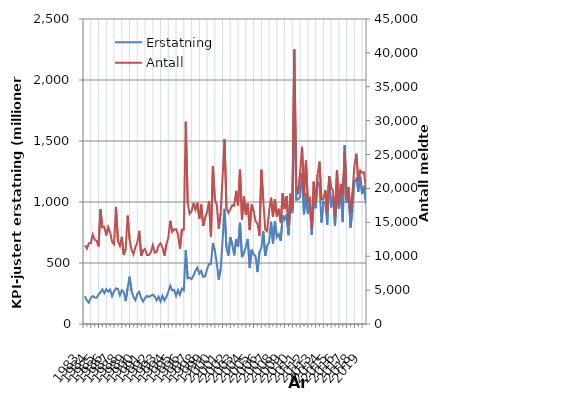
| Category | Erstatning |
|---|---|
| 1983.0 | 227.996 |
| nan | 190.982 |
| nan | 174.653 |
| nan | 213.943 |
| 1984.0 | 229.417 |
| nan | 217.012 |
| nan | 215.163 |
| nan | 240.661 |
| 1985.0 | 260.066 |
| nan | 284.26 |
| nan | 251.888 |
| nan | 285.674 |
| 1986.0 | 264.864 |
| nan | 283.416 |
| nan | 228.111 |
| nan | 266.943 |
| 1987.0 | 291.63 |
| nan | 287.785 |
| nan | 235.506 |
| nan | 277.08 |
| 1988.0 | 263.725 |
| nan | 187.995 |
| nan | 292.807 |
| nan | 387.887 |
| 1989.0 | 274.034 |
| nan | 221.485 |
| nan | 194.888 |
| nan | 245.873 |
| 1990.0 | 263.265 |
| nan | 211.798 |
| nan | 183.685 |
| nan | 213.803 |
| 1991.0 | 230.713 |
| nan | 221.83 |
| nan | 232.16 |
| nan | 240.024 |
| 1992.0 | 224.227 |
| nan | 193.206 |
| nan | 223.245 |
| nan | 184.221 |
| 1993.0 | 231.147 |
| nan | 192.366 |
| nan | 222.245 |
| nan | 262.922 |
| 1994.0 | 314.907 |
| nan | 275.3 |
| nan | 279.702 |
| nan | 230.544 |
| 1995.0 | 277.757 |
| nan | 238.953 |
| nan | 290.353 |
| nan | 275.676 |
| 1996.0 | 604.555 |
| nan | 374.351 |
| nan | 381.039 |
| nan | 367.482 |
| 1997.0 | 397.832 |
| nan | 436.552 |
| nan | 462.314 |
| nan | 412.491 |
| 1998.0 | 435.168 |
| nan | 385.517 |
| nan | 391.816 |
| nan | 450.348 |
| 1999.0 | 491.2 |
| nan | 493.586 |
| nan | 664.183 |
| nan | 601.506 |
| 2000.0 | 501.395 |
| nan | 364.123 |
| nan | 451.409 |
| nan | 688.26 |
| 2001.0 | 944.558 |
| nan | 625.301 |
| nan | 561.603 |
| nan | 710.543 |
| 2002.0 | 647.132 |
| nan | 563.068 |
| nan | 695.855 |
| nan | 634.079 |
| 2003.0 | 829.288 |
| nan | 548.295 |
| nan | 583.317 |
| nan | 635.438 |
| 2004.0 | 697.11 |
| nan | 460.882 |
| nan | 609.304 |
| nan | 569.512 |
| 2005.0 | 557.413 |
| nan | 425.383 |
| nan | 590.547 |
| nan | 625.831 |
| 2006.0 | 760.709 |
| nan | 557.875 |
| nan | 641.904 |
| nan | 669.684 |
| 2007.0 | 838.242 |
| nan | 659.035 |
| nan | 842.028 |
| nan | 711.919 |
| 2008.0 | 736.217 |
| nan | 681.552 |
| nan | 890.146 |
| nan | 854.893 |
| 2009.0 | 897.115 |
| nan | 728.315 |
| nan | 962.084 |
| nan | 909.371 |
| 2010.0 | 1994.791 |
| nan | 1017.443 |
| nan | 1022.337 |
| nan | 1045.894 |
| 2011.0 | 1236.055 |
| nan | 898.831 |
| nan | 1071.718 |
| nan | 903.205 |
| 2012.0 | 1000.628 |
| nan | 731.55 |
| nan | 1008.603 |
| nan | 949.695 |
| 2013.0 | 1166.325 |
| nan | 1142.053 |
| nan | 831.01 |
| nan | 1003.763 |
| 2014.0 | 989.981 |
| nan | 812.969 |
| nan | 1195.921 |
| nan | 956.211 |
| 2015.0 | 1049.087 |
| nan | 803.417 |
| nan | 1063.495 |
| nan | 944.262 |
| 2016.0 | 1085.503 |
| nan | 835.552 |
| nan | 1465.409 |
| nan | 994.281 |
| 2017.0 | 1065.855 |
| nan | 790.519 |
| nan | 933.611 |
| nan | 1165.77 |
| 2018.0 | 1190.083 |
| nan | 1082.659 |
| nan | 1206.789 |
| nan | 1064.742 |
| 2019.0 | 1132.601 |
| nan | 987.546 |